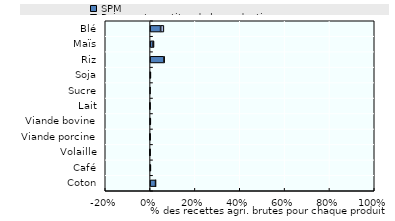
| Category | SPM | Paiements au titre de la production | Autres transferts au titre d'un seul produit |
|---|---|---|---|
| Coton | 0.025 | 0 | 0.001 |
| Café | 0 | 0 | 0.004 |
| Volaille | -0.003 | 0 | 0 |
| Viande porcine | -0.002 | 0 | 0.001 |
| Viande bovine | 0 | 0 | 0.003 |
| Lait | -0.001 | 0 | 0 |
| Sucre | 0 | 0 | 0.001 |
| Soja | 0 | 0 | 0.004 |
| Riz | 0.061 | 0 | 0.003 |
| Maïs | 0.012 | 0 | 0.005 |
| Blé | 0.047 | 0 | 0.014 |